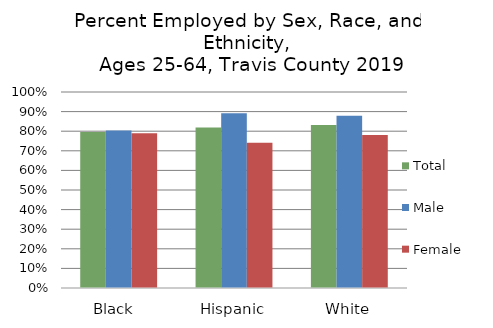
| Category | Total  | Male  | Female |
|---|---|---|---|
| Black  | 0.796 | 0.803 | 0.789 |
| Hispanic | 0.819 | 0.891 | 0.741 |
| White | 0.831 | 0.878 | 0.781 |